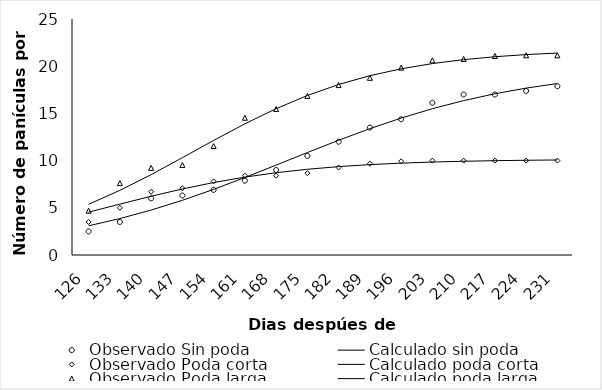
| Category | Observado Sin poda | Calculado sin poda | Observado Poda corta | Calculado poda corta | Observado Poda larga | Calculado poda larga |
|---|---|---|---|---|---|---|
| 126.0 | 2.5 | 3.093 | 3.5 | 4.54 | 4.692 | 5.374 |
| 133.0 | 3.5 | 3.858 | 5 | 5.391 | 7.615 | 6.847 |
| 140.0 | 6 | 4.759 | 6.7 | 6.223 | 9.231 | 8.514 |
| 147.0 | 6.3 | 5.795 | 7.07 | 6.995 | 9.538 | 10.308 |
| 154.0 | 6.9 | 6.952 | 7.8 | 7.676 | 11.538 | 12.135 |
| 161.0 | 7.875 | 8.207 | 8.4 | 8.25 | 14.538 | 13.895 |
| 168.0 | 9 | 9.523 | 8.4 | 8.715 | 15.462 | 15.501 |
| 175.0 | 10.5 | 10.854 | 8.67 | 9.081 | 16.846 | 16.898 |
| 182.0 | 12 | 12.156 | 9.27 | 9.362 | 18 | 18.06 |
| 189.0 | 13.5 | 13.383 | 9.67 | 9.574 | 18.769 | 18.994 |
| 196.0 | 14.375 | 14.505 | 9.93 | 9.731 | 19.846 | 19.723 |
| 203.0 | 16.125 | 15.499 | 10 | 9.847 | 20.615 | 20.279 |
| 210.0 | 17 | 16.356 | 10 | 9.931 | 20.769 | 20.696 |
| 217.0 | 17 | 17.08 | 10 | 9.992 | 21.077 | 21.004 |
| 224.0 | 17.375 | 17.678 | 10 | 10.036 | 21.154 | 21.23 |
| 231.0 | 17.875 | 18.166 | 10 | 10.068 | 21.154 | 21.395 |